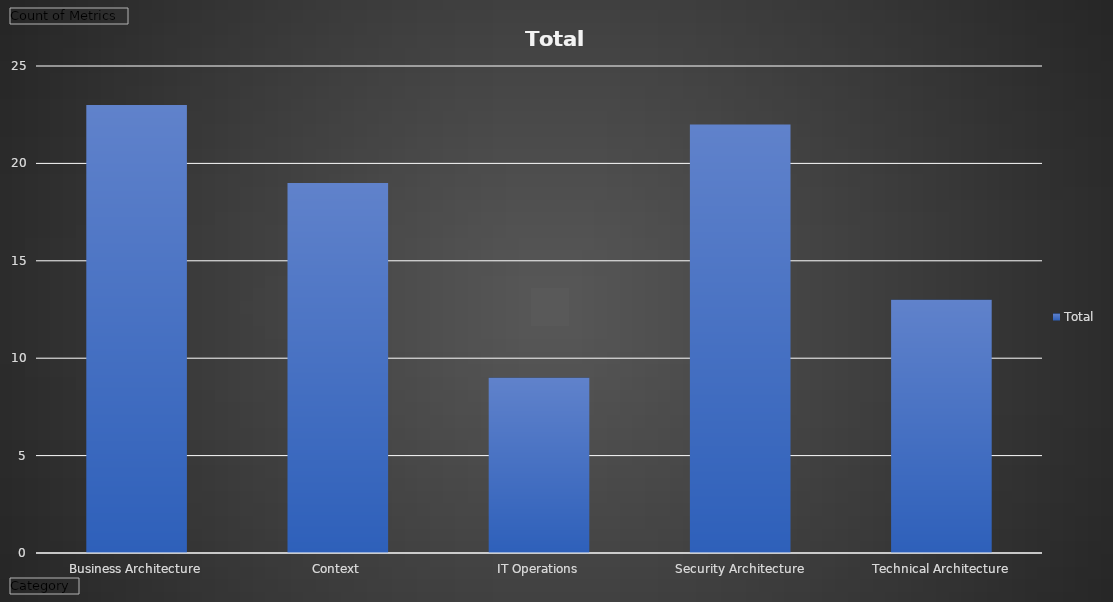
| Category | Total |
|---|---|
| Business Architecture | 23 |
| Context | 19 |
| IT Operations | 9 |
| Security Architecture | 22 |
| Technical Architecture | 13 |